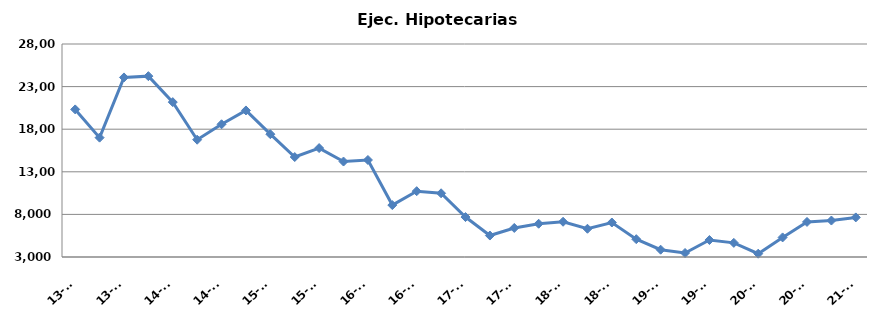
| Category | Ej. Hipotecarias |
|---|---|
| 13-T2 | 20323 |
| 13-T3 | 17009 |
| 13-T4 | 24076 |
| 14-T1 | 24226 |
| 14-T2 | 21178 |
| 14-T3 | 16767 |
| 14-T4 | 18578 |
| 15-T1 | 20201 |
| 15-T2 | 17414 |
| 15-T3 | 14735 |
| 15-T4 | 15785 |
| 16-T1 | 14205 |
| 16-T2 | 14385 |
| 16-T3 | 9094 |
| 16-T4 | 10726 |
| 17-T1 | 10478 |
| 17-T2 | 7689 |
| 17-T3 | 5518 |
| 17-T4 | 6409 |
| 18-T1 | 6903 |
| 18-T2 | 7137 |
| 18-T3 | 6315 |
| 18-T4 | 7049 |
| 19-T1 | 5092 |
| 19-T2 | 3857 |
| 19-T3 | 3470 |
| 19-T4 | 4992 |
| 20-T1 | 4658 |
| 20-T2 | 3387 |
| 20-T3 | 5299 |
| 20-T4 | 7116 |
| 21-T1 | 7280 |
| 21-T2 | 7646 |